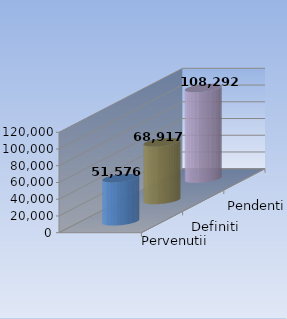
| Category | Pervenutii | Definiti | Pendenti |
|---|---|---|---|
| 0 | 51576 | 68917 | 108292 |